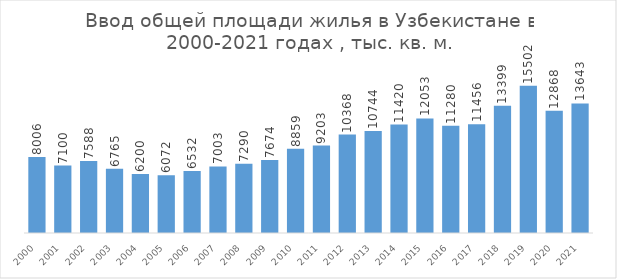
| Category | Ввод в действие жилых домов, тыс.кв.м. общей площади |
|---|---|
| 2000.0 | 8006 |
| 2001.0 | 7100 |
| 2002.0 | 7588 |
| 2003.0 | 6765 |
| 2004.0 | 6200 |
| 2005.0 | 6072 |
| 2006.0 | 6532 |
| 2007.0 | 7003 |
| 2008.0 | 7290 |
| 2009.0 | 7674 |
| 2010.0 | 8859 |
| 2011.0 | 9203 |
| 2012.0 | 10368 |
| 2013.0 | 10744 |
| 2014.0 | 11420 |
| 2015.0 | 12053 |
| 2016.0 | 11280 |
| 2017.0 | 11456 |
| 2018.0 | 13399 |
| 2019.0 | 15502 |
| 2020.0 | 12868 |
| 2021.0 | 13643 |